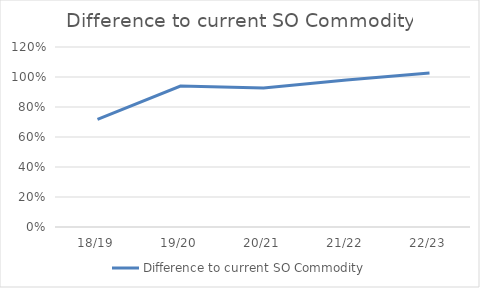
| Category | Difference to current SO Commodity |
|---|---|
| 18/19 | 0.718 |
| 19/20 | 0.94 |
| 20/21 | 0.926 |
| 21/22 | 0.98 |
| 22/23 | 1.027 |